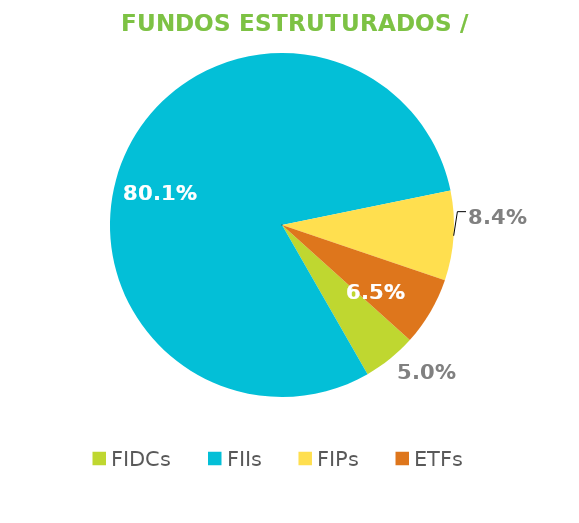
| Category | Fundos Estruturados / ETFs |
|---|---|
| FIDCs | 0.05 |
| FIIs | 0.801 |
| FIPs | 0.084 |
| ETFs | 0.065 |